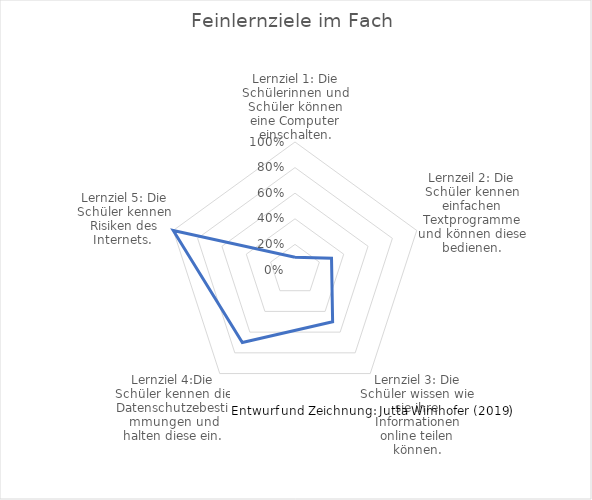
| Category | Series 0 |
|---|---|
| Lernziel 1: Die Schülerinnen und Schüler können eine Computer einschalten. | 0.1 |
| Lernzeil 2: Die Schüler kennen einfachen Textprogramme und können diese bedienen. | 0.3 |
| Lernziel 3: Die Schüler wissen wie sie ihre Informationen online teilen können. | 0.5 |
| Lernziel 4:Die Schüler kennen die Datenschutzebestimmungen und halten diese ein. | 0.7 |
| Lernziel 5: Die Schüler kennen Risiken des Internets.  | 1 |